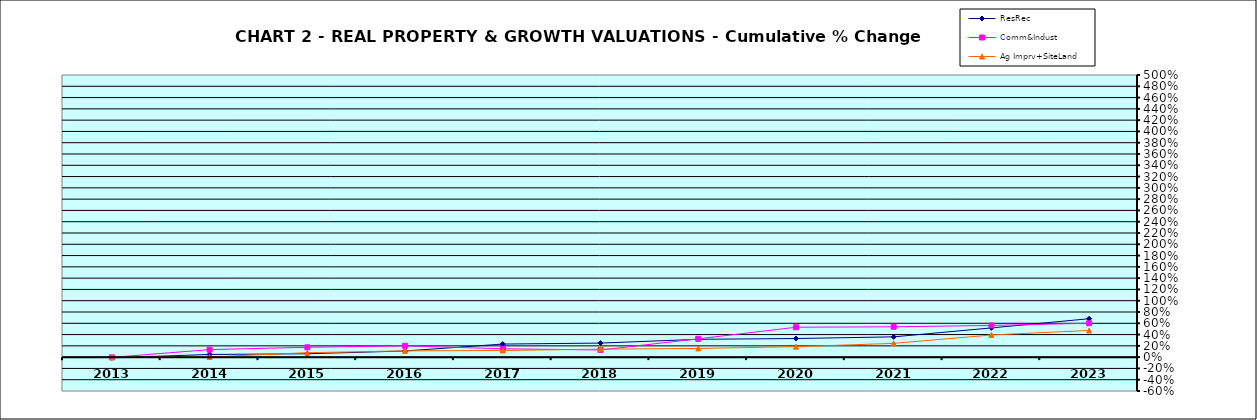
| Category | ResRec | Comm&Indust | Ag Imprv+SiteLand |
|---|---|---|---|
| 2013.0 | -0.012 | -0.004 | 0 |
| 2014.0 | 0.047 | 0.134 | 0.003 |
| 2015.0 | 0.06 | 0.175 | 0.079 |
| 2016.0 | 0.109 | 0.201 | 0.111 |
| 2017.0 | 0.232 | 0.148 | 0.118 |
| 2018.0 | 0.249 | 0.127 | 0.141 |
| 2019.0 | 0.316 | 0.325 | 0.154 |
| 2020.0 | 0.33 | 0.53 | 0.185 |
| 2021.0 | 0.36 | 0.538 | 0.245 |
| 2022.0 | 0.518 | 0.562 | 0.393 |
| 2023.0 | 0.681 | 0.601 | 0.474 |